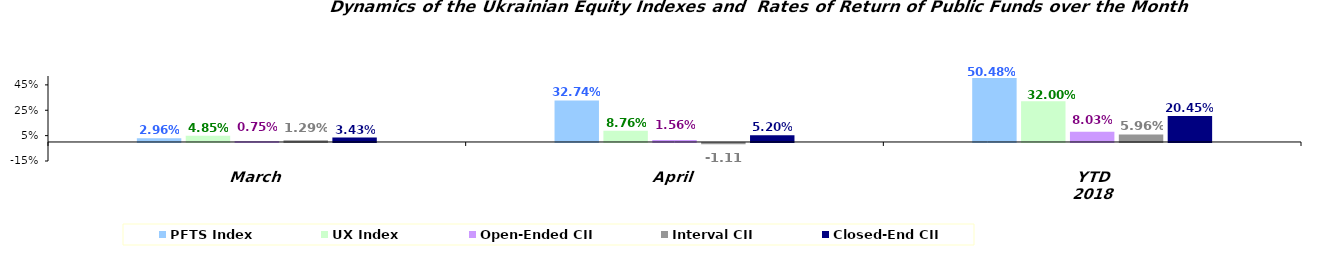
| Category | PFTS Index | UX Index | Open-Ended CII | Interval CII | Closed-End CII |
|---|---|---|---|---|---|
| March | 0.03 | 0.049 | 0.007 | 0.013 | 0.034 |
| April | 0.327 | 0.088 | 0.016 | -0.011 | 0.052 |
| YTD 2018 | 0.505 | 0.32 | 0.08 | 0.06 | 0.204 |